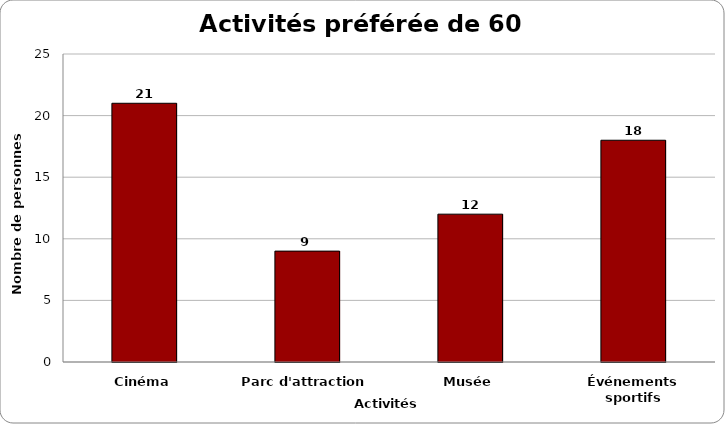
| Category | Effectif |
|---|---|
| Cinéma | 21 |
| Parc d'attraction | 9 |
| Musée | 12 |
| Événements sportifs | 18 |